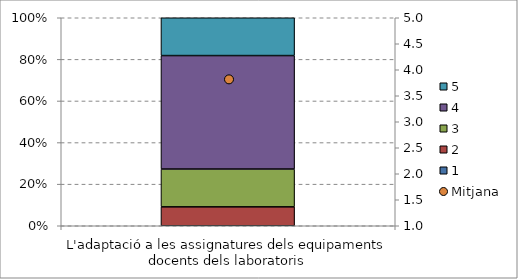
| Category | 1 | 2 | 3 | 4 | 5 |
|---|---|---|---|---|---|
| L'adaptació a les assignatures dels equipaments docents dels laboratoris | 0 | 0.091 | 0.182 | 0.546 | 0.182 |